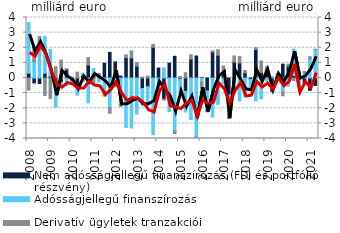
| Category | Nem adósságjellegű finanszírozás (FDI és portfólió részvény) | Adósságjellegű finanszírozás | Derivatív ügyletek tranzakciói |
|---|---|---|---|
| 2008.0 | 0.319 | 3.349 | -0.797 |
| 2008.0 | -0.326 | 1.088 | 0.986 |
| 2008.0 | -0.366 | 2.453 | 0.292 |
| 2008.0 | 0.315 | 2.442 | -1.152 |
| 2009.0 | 0.113 | 1.76 | -1.358 |
| 2009.0 | -0.448 | -1.481 | 0.758 |
| 2009.0 | -0.287 | -0.441 | 1.181 |
| 2009.0 | 0.559 | -0.524 | 0.06 |
| 2010.0 | -0.179 | 0.064 | -0.028 |
| 2010.0 | -0.678 | -0.45 | 0.384 |
| 2010.0 | 0.183 | 0.133 | -0.216 |
| 2010.0 | 0.857 | -1.641 | 0.485 |
| 2011.0 | 0.298 | 0.326 | -0.362 |
| 2011.0 | -0.011 | -0.266 | 0.301 |
| 2011.0 | 0.974 | -0.835 | -0.355 |
| 2011.0 | 1.693 | -1.961 | -0.372 |
| 2012.0 | 1.063 | -0.353 | -0.228 |
| 2012.0 | 0.13 | -1.763 | -0.112 |
| 2012.0 | 1.346 | -3.272 | 0.185 |
| 2012.0 | 1.326 | -3.304 | 0.461 |
| 2013.0 | 0.78 | -2.385 | 0.238 |
| 2013.0 | -0.692 | -1.108 | 0.057 |
| 2013.0 | -0.575 | -1.279 | 0.129 |
| 2013.0 | 2.028 | -3.746 | 0.193 |
| 2014.0 | 0.658 | -0.891 | -0.015 |
| 2014.0 | -1.401 | 0.662 | -0.062 |
| 2014.0 | 0.98 | -2.179 | -0.012 |
| 2014.0 | 1.434 | -3.495 | -0.175 |
| 2015.0 | -0.087 | -0.895 | 0.108 |
| 2015.0 | -0.883 | -1.363 | 0.349 |
| 2015.0 | 1.247 | -2.748 | 0.289 |
| 2015.0 | 1.453 | -3.918 | -0.059 |
| 2016.0 | 0.039 | -0.282 | -0.406 |
| 2016.0 | -0.856 | -1.305 | -0.078 |
| 2016.0 | 1.724 | -2.575 | 0.07 |
| 2016.0 | 1.499 | -1.739 | 0.361 |
| 2017.0 | 0.303 | -0.382 | 0.484 |
| 2017.0 | -1.106 | -1.326 | -0.251 |
| 2017.0 | 1.063 | -0.941 | 0.391 |
| 2017.0 | 0.996 | -1.523 | 0.425 |
| 2018.0 | 0.339 | -1.244 | 0.158 |
| 2018.0 | -0.083 | -0.633 | -0.11 |
| 2018.0 | 1.884 | -1.506 | 0.124 |
| 2018.0 | 0.368 | -1.376 | 0.761 |
| 2019.0 | 0.514 | -0.177 | 0.226 |
| 2019.0 | -0.873 | 0.067 | 0.001 |
| 2019.0 | 0.084 | 0.176 | 0.012 |
| 2019.0 | 0.914 | -0.912 | -0.261 |
| 2020.0 | 0.78 | -0.543 | 0.13 |
| 2020.0 | 0.163 | 1.75 | -0.167 |
| 2020.0 | 0.035 | -0.484 | 0.401 |
| 2020.0 | -0.311 | 0.347 | 0.08 |
| 2021.0 | -0.818 | 1.255 | 0.153 |
| 2021.0 | -0.493 | 1.894 | 0.003 |